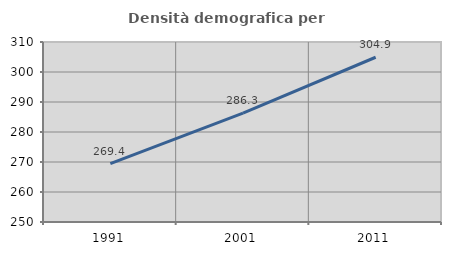
| Category | Densità demografica |
|---|---|
| 1991.0 | 269.433 |
| 2001.0 | 286.273 |
| 2011.0 | 304.917 |